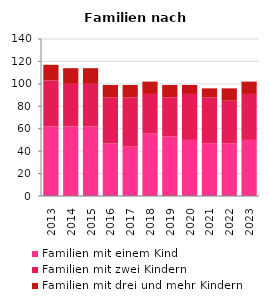
| Category | Familien mit einem Kind | Familien mit zwei Kindern | Familien mit drei und mehr Kindern |
|---|---|---|---|
| 2013.0 | 62 | 41 | 14 |
| 2014.0 | 62 | 38 | 14 |
| 2015.0 | 62 | 38 | 14 |
| 2016.0 | 47 | 41 | 11 |
| 2017.0 | 44 | 44 | 11 |
| 2018.0 | 56 | 35 | 11 |
| 2019.0 | 53 | 35 | 11 |
| 2020.0 | 50 | 41 | 8 |
| 2021.0 | 47 | 41 | 8 |
| 2022.0 | 47 | 38 | 11 |
| 2023.0 | 50 | 41 | 11 |